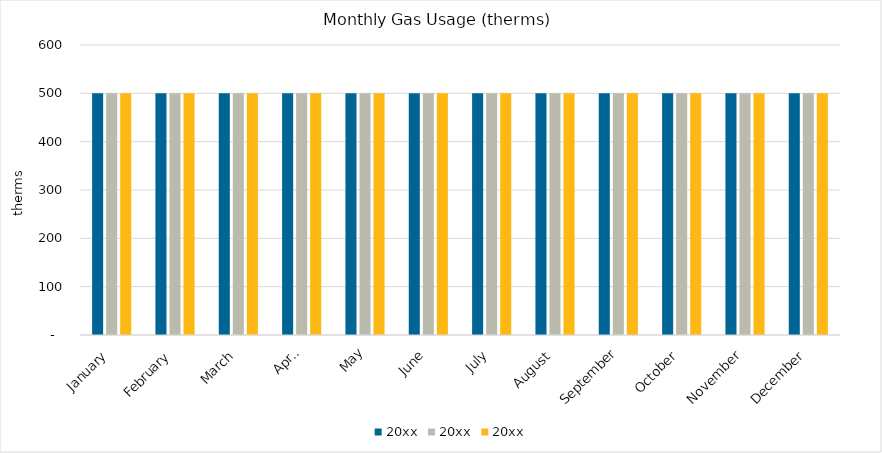
| Category | 20xx |
|---|---|
| January | 500 |
| February | 500 |
| March | 500 |
| April | 500 |
| May | 500 |
| June | 500 |
| July | 500 |
| August | 500 |
| September | 500 |
| October | 500 |
| November | 500 |
| December | 500 |